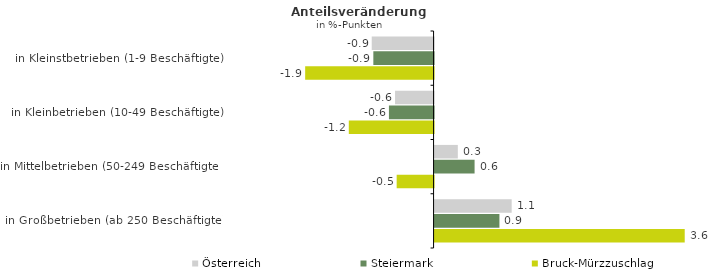
| Category | Österreich | Steiermark | Bruck-Mürzzuschlag |
|---|---|---|---|
| in Kleinstbetrieben (1-9 Beschäftigte) | -0.898 | -0.875 | -1.865 |
| in Kleinbetrieben (10-49 Beschäftigte) | -0.559 | -0.648 | -1.231 |
| in Mittelbetrieben (50-249 Beschäftigte) | 0.338 | 0.581 | -0.536 |
| in Großbetrieben (ab 250 Beschäftigte) | 1.12 | 0.942 | 3.633 |